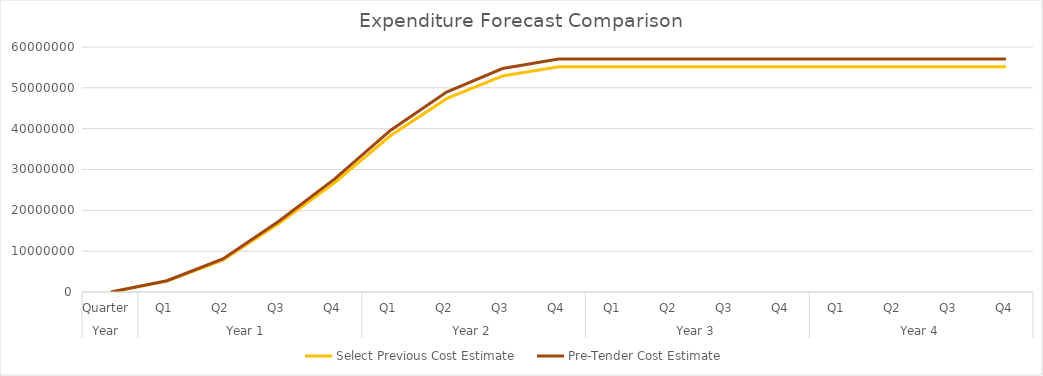
| Category | Select Previous Cost Estimate | Pre-Tender Cost Estimate |
|---|---|---|
| 0 | 0 | 0 |
| 1 | 2669718.775 | 2761252.503 |
| 2 | 7827130.046 | 8095490.293 |
| 3 | 16751933.721 | 17326288.95 |
| 4 | 26790958.868 | 27709511.172 |
| 5 | 38308258.047 | 39621691.391 |
| 6 | 47348896.628 | 48972296.459 |
| 7 | 52914488.042 | 54728709.218 |
| 8 | 55159478.83 | 57050671.55 |
| 9 | 55159478.83 | 57050671.55 |
| 10 | 55159478.83 | 57050671.55 |
| 11 | 55159478.83 | 57050671.55 |
| 12 | 55159478.83 | 57050671.55 |
| 13 | 55159478.83 | 57050671.55 |
| 14 | 55159478.83 | 57050671.55 |
| 15 | 55159478.83 | 57050671.55 |
| 16 | 55159478.83 | 57050671.55 |